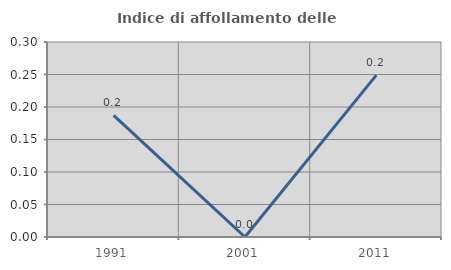
| Category | Indice di affollamento delle abitazioni  |
|---|---|
| 1991.0 | 0.187 |
| 2001.0 | 0 |
| 2011.0 | 0.249 |